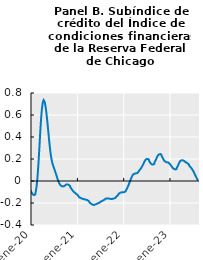
| Category | -0.0836 |
|---|---|
| 2020-01-02 | -0.084 |
| 2020-01-03 | -0.099 |
| 2020-01-06 | -0.099 |
| 2020-01-07 | -0.099 |
| 2020-01-08 | -0.099 |
| 2020-01-09 | -0.099 |
| 2020-01-10 | -0.112 |
| 2020-01-13 | -0.112 |
| 2020-01-14 | -0.112 |
| 2020-01-15 | -0.112 |
| 2020-01-16 | -0.112 |
| 2020-01-17 | -0.123 |
| 2020-01-20 | -0.123 |
| 2020-01-21 | -0.123 |
| 2020-01-22 | -0.123 |
| 2020-01-23 | -0.123 |
| 2020-01-24 | -0.128 |
| 2020-01-27 | -0.128 |
| 2020-01-28 | -0.128 |
| 2020-01-29 | -0.128 |
| 2020-01-30 | -0.128 |
| 2020-01-31 | -0.122 |
| 2020-02-03 | -0.122 |
| 2020-02-04 | -0.122 |
| 2020-02-05 | -0.122 |
| 2020-02-06 | -0.122 |
| 2020-02-07 | -0.101 |
| 2020-02-10 | -0.101 |
| 2020-02-11 | -0.101 |
| 2020-02-12 | -0.101 |
| 2020-02-13 | -0.101 |
| 2020-02-14 | -0.055 |
| 2020-02-17 | -0.055 |
| 2020-02-18 | -0.055 |
| 2020-02-19 | -0.055 |
| 2020-02-20 | -0.055 |
| 2020-02-21 | 0.024 |
| 2020-02-24 | 0.024 |
| 2020-02-25 | 0.024 |
| 2020-02-26 | 0.024 |
| 2020-02-27 | 0.024 |
| 2020-02-28 | 0.135 |
| 2020-03-02 | 0.135 |
| 2020-03-03 | 0.135 |
| 2020-03-04 | 0.135 |
| 2020-03-05 | 0.135 |
| 2020-03-06 | 0.271 |
| 2020-03-09 | 0.271 |
| 2020-03-10 | 0.271 |
| 2020-03-11 | 0.271 |
| 2020-03-12 | 0.271 |
| 2020-03-13 | 0.415 |
| 2020-03-16 | 0.415 |
| 2020-03-17 | 0.415 |
| 2020-03-18 | 0.415 |
| 2020-03-19 | 0.415 |
| 2020-03-20 | 0.549 |
| 2020-03-23 | 0.549 |
| 2020-03-24 | 0.549 |
| 2020-03-25 | 0.549 |
| 2020-03-26 | 0.549 |
| 2020-03-27 | 0.649 |
| 2020-03-30 | 0.649 |
| 2020-03-31 | 0.649 |
| 2020-04-01 | 0.649 |
| 2020-04-02 | 0.649 |
| 2020-04-03 | 0.712 |
| 2020-04-06 | 0.712 |
| 2020-04-07 | 0.712 |
| 2020-04-08 | 0.712 |
| 2020-04-09 | 0.712 |
| 2020-04-10 | 0.736 |
| 2020-04-13 | 0.736 |
| 2020-04-14 | 0.736 |
| 2020-04-15 | 0.736 |
| 2020-04-16 | 0.736 |
| 2020-04-17 | 0.724 |
| 2020-04-20 | 0.724 |
| 2020-04-21 | 0.724 |
| 2020-04-22 | 0.724 |
| 2020-04-23 | 0.724 |
| 2020-04-24 | 0.688 |
| 2020-04-27 | 0.688 |
| 2020-04-28 | 0.688 |
| 2020-04-29 | 0.688 |
| 2020-04-30 | 0.688 |
| 2020-05-01 | 0.629 |
| 2020-05-04 | 0.629 |
| 2020-05-05 | 0.629 |
| 2020-05-06 | 0.629 |
| 2020-05-07 | 0.629 |
| 2020-05-08 | 0.555 |
| 2020-05-11 | 0.555 |
| 2020-05-12 | 0.555 |
| 2020-05-13 | 0.555 |
| 2020-05-14 | 0.555 |
| 2020-05-15 | 0.473 |
| 2020-05-18 | 0.473 |
| 2020-05-19 | 0.473 |
| 2020-05-20 | 0.473 |
| 2020-05-21 | 0.473 |
| 2020-05-22 | 0.388 |
| 2020-05-25 | 0.388 |
| 2020-05-26 | 0.388 |
| 2020-05-27 | 0.388 |
| 2020-05-28 | 0.388 |
| 2020-05-29 | 0.309 |
| 2020-06-01 | 0.309 |
| 2020-06-02 | 0.309 |
| 2020-06-03 | 0.309 |
| 2020-06-04 | 0.309 |
| 2020-06-05 | 0.243 |
| 2020-06-08 | 0.243 |
| 2020-06-09 | 0.243 |
| 2020-06-10 | 0.243 |
| 2020-06-11 | 0.243 |
| 2020-06-12 | 0.194 |
| 2020-06-15 | 0.194 |
| 2020-06-16 | 0.194 |
| 2020-06-17 | 0.194 |
| 2020-06-18 | 0.194 |
| 2020-06-19 | 0.158 |
| 2020-06-22 | 0.158 |
| 2020-06-23 | 0.158 |
| 2020-06-24 | 0.158 |
| 2020-06-25 | 0.158 |
| 2020-06-26 | 0.133 |
| 2020-06-29 | 0.133 |
| 2020-06-30 | 0.133 |
| 2020-07-01 | 0.133 |
| 2020-07-02 | 0.133 |
| 2020-07-03 | 0.111 |
| 2020-07-06 | 0.111 |
| 2020-07-07 | 0.111 |
| 2020-07-08 | 0.111 |
| 2020-07-09 | 0.111 |
| 2020-07-10 | 0.087 |
| 2020-07-13 | 0.087 |
| 2020-07-14 | 0.087 |
| 2020-07-15 | 0.087 |
| 2020-07-16 | 0.087 |
| 2020-07-17 | 0.063 |
| 2020-07-20 | 0.063 |
| 2020-07-21 | 0.063 |
| 2020-07-22 | 0.063 |
| 2020-07-23 | 0.063 |
| 2020-07-24 | 0.037 |
| 2020-07-27 | 0.037 |
| 2020-07-28 | 0.037 |
| 2020-07-29 | 0.037 |
| 2020-07-30 | 0.037 |
| 2020-07-31 | 0.012 |
| 2020-08-03 | 0.012 |
| 2020-08-04 | 0.012 |
| 2020-08-05 | 0.012 |
| 2020-08-06 | 0.012 |
| 2020-08-07 | -0.009 |
| 2020-08-10 | -0.009 |
| 2020-08-11 | -0.009 |
| 2020-08-12 | -0.009 |
| 2020-08-13 | -0.009 |
| 2020-08-14 | -0.026 |
| 2020-08-17 | -0.026 |
| 2020-08-18 | -0.026 |
| 2020-08-19 | -0.026 |
| 2020-08-20 | -0.026 |
| 2020-08-21 | -0.039 |
| 2020-08-24 | -0.039 |
| 2020-08-25 | -0.039 |
| 2020-08-26 | -0.039 |
| 2020-08-27 | -0.039 |
| 2020-08-28 | -0.047 |
| 2020-08-31 | -0.047 |
| 2020-09-01 | -0.047 |
| 2020-09-02 | -0.047 |
| 2020-09-03 | -0.047 |
| 2020-09-04 | -0.049 |
| 2020-09-07 | -0.049 |
| 2020-09-08 | -0.049 |
| 2020-09-09 | -0.049 |
| 2020-09-10 | -0.049 |
| 2020-09-11 | -0.048 |
| 2020-09-14 | -0.048 |
| 2020-09-15 | -0.048 |
| 2020-09-16 | -0.048 |
| 2020-09-17 | -0.048 |
| 2020-09-18 | -0.044 |
| 2020-09-21 | -0.044 |
| 2020-09-22 | -0.044 |
| 2020-09-23 | -0.044 |
| 2020-09-24 | -0.044 |
| 2020-09-25 | -0.038 |
| 2020-09-28 | -0.038 |
| 2020-09-29 | -0.038 |
| 2020-09-30 | -0.038 |
| 2020-10-01 | -0.038 |
| 2020-10-02 | -0.033 |
| 2020-10-05 | -0.033 |
| 2020-10-06 | -0.033 |
| 2020-10-07 | -0.033 |
| 2020-10-08 | -0.033 |
| 2020-10-09 | -0.031 |
| 2020-10-12 | -0.031 |
| 2020-10-13 | -0.031 |
| 2020-10-14 | -0.031 |
| 2020-10-15 | -0.031 |
| 2020-10-16 | -0.033 |
| 2020-10-19 | -0.033 |
| 2020-10-20 | -0.033 |
| 2020-10-21 | -0.033 |
| 2020-10-22 | -0.033 |
| 2020-10-23 | -0.038 |
| 2020-10-26 | -0.038 |
| 2020-10-27 | -0.038 |
| 2020-10-28 | -0.038 |
| 2020-10-29 | -0.038 |
| 2020-10-30 | -0.045 |
| 2020-11-02 | -0.045 |
| 2020-11-03 | -0.045 |
| 2020-11-04 | -0.045 |
| 2020-11-05 | -0.045 |
| 2020-11-06 | -0.055 |
| 2020-11-09 | -0.055 |
| 2020-11-10 | -0.055 |
| 2020-11-11 | -0.055 |
| 2020-11-12 | -0.055 |
| 2020-11-13 | -0.067 |
| 2020-11-16 | -0.067 |
| 2020-11-17 | -0.067 |
| 2020-11-18 | -0.067 |
| 2020-11-19 | -0.067 |
| 2020-11-20 | -0.079 |
| 2020-11-23 | -0.079 |
| 2020-11-24 | -0.079 |
| 2020-11-25 | -0.079 |
| 2020-11-26 | -0.079 |
| 2020-11-27 | -0.089 |
| 2020-11-30 | -0.089 |
| 2020-12-01 | -0.089 |
| 2020-12-02 | -0.089 |
| 2020-12-03 | -0.089 |
| 2020-12-04 | -0.099 |
| 2020-12-07 | -0.099 |
| 2020-12-08 | -0.099 |
| 2020-12-09 | -0.099 |
| 2020-12-10 | -0.099 |
| 2020-12-11 | -0.108 |
| 2020-12-14 | -0.108 |
| 2020-12-15 | -0.108 |
| 2020-12-16 | -0.108 |
| 2020-12-17 | -0.108 |
| 2020-12-18 | -0.116 |
| 2020-12-21 | -0.116 |
| 2020-12-22 | -0.116 |
| 2020-12-23 | -0.116 |
| 2020-12-24 | -0.116 |
| 2020-12-25 | -0.124 |
| 2020-12-28 | -0.124 |
| 2020-12-29 | -0.124 |
| 2020-12-30 | -0.124 |
| 2020-12-31 | -0.124 |
| 2021-01-01 | -0.132 |
| 2021-01-04 | -0.132 |
| 2021-01-05 | -0.132 |
| 2021-01-06 | -0.132 |
| 2021-01-07 | -0.132 |
| 2021-01-08 | -0.14 |
| 2021-01-11 | -0.14 |
| 2021-01-12 | -0.14 |
| 2021-01-13 | -0.14 |
| 2021-01-14 | -0.14 |
| 2021-01-15 | -0.147 |
| 2021-01-18 | -0.147 |
| 2021-01-19 | -0.147 |
| 2021-01-20 | -0.147 |
| 2021-01-21 | -0.147 |
| 2021-01-22 | -0.153 |
| 2021-01-25 | -0.153 |
| 2021-01-26 | -0.153 |
| 2021-01-27 | -0.153 |
| 2021-01-28 | -0.153 |
| 2021-01-29 | -0.158 |
| 2021-02-01 | -0.158 |
| 2021-02-02 | -0.158 |
| 2021-02-03 | -0.158 |
| 2021-02-04 | -0.158 |
| 2021-02-05 | -0.161 |
| 2021-02-08 | -0.161 |
| 2021-02-09 | -0.161 |
| 2021-02-10 | -0.161 |
| 2021-02-11 | -0.161 |
| 2021-02-12 | -0.164 |
| 2021-02-15 | -0.164 |
| 2021-02-16 | -0.164 |
| 2021-02-17 | -0.164 |
| 2021-02-18 | -0.164 |
| 2021-02-19 | -0.165 |
| 2021-02-22 | -0.165 |
| 2021-02-23 | -0.165 |
| 2021-02-24 | -0.165 |
| 2021-02-25 | -0.165 |
| 2021-02-26 | -0.167 |
| 2021-03-01 | -0.167 |
| 2021-03-02 | -0.167 |
| 2021-03-03 | -0.167 |
| 2021-03-04 | -0.167 |
| 2021-03-05 | -0.169 |
| 2021-03-08 | -0.169 |
| 2021-03-09 | -0.169 |
| 2021-03-10 | -0.169 |
| 2021-03-11 | -0.169 |
| 2021-03-12 | -0.172 |
| 2021-03-15 | -0.172 |
| 2021-03-16 | -0.172 |
| 2021-03-17 | -0.172 |
| 2021-03-18 | -0.172 |
| 2021-03-19 | -0.176 |
| 2021-03-22 | -0.176 |
| 2021-03-23 | -0.176 |
| 2021-03-24 | -0.176 |
| 2021-03-25 | -0.176 |
| 2021-03-26 | -0.182 |
| 2021-03-29 | -0.182 |
| 2021-03-30 | -0.182 |
| 2021-03-31 | -0.182 |
| 2021-04-01 | -0.182 |
| 2021-04-02 | -0.189 |
| 2021-04-05 | -0.189 |
| 2021-04-06 | -0.189 |
| 2021-04-07 | -0.189 |
| 2021-04-08 | -0.189 |
| 2021-04-09 | -0.198 |
| 2021-04-12 | -0.198 |
| 2021-04-13 | -0.198 |
| 2021-04-14 | -0.198 |
| 2021-04-15 | -0.198 |
| 2021-04-16 | -0.206 |
| 2021-04-19 | -0.206 |
| 2021-04-20 | -0.206 |
| 2021-04-21 | -0.206 |
| 2021-04-22 | -0.206 |
| 2021-04-23 | -0.212 |
| 2021-04-26 | -0.212 |
| 2021-04-27 | -0.212 |
| 2021-04-28 | -0.212 |
| 2021-04-29 | -0.212 |
| 2021-04-30 | -0.217 |
| 2021-05-03 | -0.217 |
| 2021-05-04 | -0.217 |
| 2021-05-05 | -0.217 |
| 2021-05-06 | -0.217 |
| 2021-05-07 | -0.219 |
| 2021-05-10 | -0.219 |
| 2021-05-11 | -0.219 |
| 2021-05-12 | -0.219 |
| 2021-05-13 | -0.219 |
| 2021-05-14 | -0.217 |
| 2021-05-17 | -0.217 |
| 2021-05-18 | -0.217 |
| 2021-05-19 | -0.217 |
| 2021-05-20 | -0.217 |
| 2021-05-21 | -0.214 |
| 2021-05-24 | -0.214 |
| 2021-05-25 | -0.214 |
| 2021-05-26 | -0.214 |
| 2021-05-27 | -0.214 |
| 2021-05-28 | -0.21 |
| 2021-05-31 | -0.21 |
| 2021-06-01 | -0.21 |
| 2021-06-02 | -0.21 |
| 2021-06-03 | -0.21 |
| 2021-06-04 | -0.205 |
| 2021-06-07 | -0.205 |
| 2021-06-08 | -0.205 |
| 2021-06-09 | -0.205 |
| 2021-06-10 | -0.205 |
| 2021-06-11 | -0.201 |
| 2021-06-14 | -0.201 |
| 2021-06-15 | -0.201 |
| 2021-06-16 | -0.201 |
| 2021-06-17 | -0.201 |
| 2021-06-18 | -0.197 |
| 2021-06-21 | -0.197 |
| 2021-06-22 | -0.197 |
| 2021-06-23 | -0.197 |
| 2021-06-24 | -0.197 |
| 2021-06-25 | -0.193 |
| 2021-06-28 | -0.193 |
| 2021-06-29 | -0.193 |
| 2021-06-30 | -0.193 |
| 2021-07-01 | -0.193 |
| 2021-07-02 | -0.189 |
| 2021-07-05 | -0.189 |
| 2021-07-06 | -0.189 |
| 2021-07-07 | -0.189 |
| 2021-07-08 | -0.189 |
| 2021-07-09 | -0.184 |
| 2021-07-12 | -0.184 |
| 2021-07-13 | -0.184 |
| 2021-07-14 | -0.184 |
| 2021-07-15 | -0.184 |
| 2021-07-16 | -0.179 |
| 2021-07-19 | -0.179 |
| 2021-07-20 | -0.179 |
| 2021-07-21 | -0.179 |
| 2021-07-22 | -0.179 |
| 2021-07-23 | -0.173 |
| 2021-07-26 | -0.173 |
| 2021-07-27 | -0.173 |
| 2021-07-28 | -0.173 |
| 2021-07-29 | -0.173 |
| 2021-07-30 | -0.169 |
| 2021-08-02 | -0.169 |
| 2021-08-03 | -0.169 |
| 2021-08-04 | -0.169 |
| 2021-08-05 | -0.169 |
| 2021-08-06 | -0.164 |
| 2021-08-09 | -0.164 |
| 2021-08-10 | -0.164 |
| 2021-08-11 | -0.164 |
| 2021-08-12 | -0.164 |
| 2021-08-13 | -0.16 |
| 2021-08-16 | -0.16 |
| 2021-08-17 | -0.16 |
| 2021-08-18 | -0.16 |
| 2021-08-19 | -0.16 |
| 2021-08-20 | -0.158 |
| 2021-08-23 | -0.158 |
| 2021-08-24 | -0.158 |
| 2021-08-25 | -0.158 |
| 2021-08-26 | -0.158 |
| 2021-08-27 | -0.158 |
| 2021-08-30 | -0.158 |
| 2021-08-31 | -0.158 |
| 2021-09-01 | -0.158 |
| 2021-09-02 | -0.158 |
| 2021-09-03 | -0.16 |
| 2021-09-06 | -0.16 |
| 2021-09-07 | -0.16 |
| 2021-09-08 | -0.16 |
| 2021-09-09 | -0.16 |
| 2021-09-10 | -0.162 |
| 2021-09-13 | -0.162 |
| 2021-09-14 | -0.162 |
| 2021-09-15 | -0.162 |
| 2021-09-16 | -0.162 |
| 2021-09-17 | -0.163 |
| 2021-09-20 | -0.163 |
| 2021-09-21 | -0.163 |
| 2021-09-22 | -0.163 |
| 2021-09-23 | -0.163 |
| 2021-09-24 | -0.164 |
| 2021-09-27 | -0.164 |
| 2021-09-28 | -0.164 |
| 2021-09-29 | -0.164 |
| 2021-09-30 | -0.164 |
| 2021-10-01 | -0.163 |
| 2021-10-04 | -0.163 |
| 2021-10-05 | -0.163 |
| 2021-10-06 | -0.163 |
| 2021-10-07 | -0.163 |
| 2021-10-08 | -0.161 |
| 2021-10-11 | -0.161 |
| 2021-10-12 | -0.161 |
| 2021-10-13 | -0.161 |
| 2021-10-14 | -0.161 |
| 2021-10-15 | -0.158 |
| 2021-10-18 | -0.158 |
| 2021-10-19 | -0.158 |
| 2021-10-20 | -0.158 |
| 2021-10-21 | -0.158 |
| 2021-10-22 | -0.154 |
| 2021-10-25 | -0.154 |
| 2021-10-26 | -0.154 |
| 2021-10-27 | -0.154 |
| 2021-10-28 | -0.154 |
| 2021-10-29 | -0.148 |
| 2021-11-01 | -0.148 |
| 2021-11-02 | -0.148 |
| 2021-11-03 | -0.148 |
| 2021-11-04 | -0.148 |
| 2021-11-05 | -0.141 |
| 2021-11-08 | -0.141 |
| 2021-11-09 | -0.141 |
| 2021-11-10 | -0.141 |
| 2021-11-11 | -0.141 |
| 2021-11-12 | -0.133 |
| 2021-11-15 | -0.133 |
| 2021-11-16 | -0.133 |
| 2021-11-17 | -0.133 |
| 2021-11-18 | -0.133 |
| 2021-11-19 | -0.123 |
| 2021-11-22 | -0.123 |
| 2021-11-23 | -0.123 |
| 2021-11-24 | -0.123 |
| 2021-11-25 | -0.123 |
| 2021-11-26 | -0.114 |
| 2021-11-29 | -0.114 |
| 2021-11-30 | -0.114 |
| 2021-12-01 | -0.114 |
| 2021-12-02 | -0.114 |
| 2021-12-03 | -0.107 |
| 2021-12-06 | -0.107 |
| 2021-12-07 | -0.107 |
| 2021-12-08 | -0.107 |
| 2021-12-09 | -0.107 |
| 2021-12-10 | -0.104 |
| 2021-12-13 | -0.104 |
| 2021-12-14 | -0.104 |
| 2021-12-15 | -0.104 |
| 2021-12-16 | -0.104 |
| 2021-12-17 | -0.103 |
| 2021-12-20 | -0.103 |
| 2021-12-21 | -0.103 |
| 2021-12-22 | -0.103 |
| 2021-12-23 | -0.103 |
| 2021-12-24 | -0.104 |
| 2021-12-27 | -0.104 |
| 2021-12-28 | -0.104 |
| 2021-12-29 | -0.104 |
| 2021-12-30 | -0.104 |
| 2021-12-31 | -0.104 |
| 2022-01-03 | -0.104 |
| 2022-01-04 | -0.104 |
| 2022-01-05 | -0.104 |
| 2022-01-06 | -0.104 |
| 2022-01-07 | -0.1 |
| 2022-01-10 | -0.1 |
| 2022-01-11 | -0.1 |
| 2022-01-12 | -0.1 |
| 2022-01-13 | -0.1 |
| 2022-01-14 | -0.093 |
| 2022-01-17 | -0.093 |
| 2022-01-18 | -0.093 |
| 2022-01-19 | -0.093 |
| 2022-01-20 | -0.093 |
| 2022-01-21 | -0.082 |
| 2022-01-24 | -0.082 |
| 2022-01-25 | -0.082 |
| 2022-01-26 | -0.082 |
| 2022-01-27 | -0.082 |
| 2022-01-28 | -0.067 |
| 2022-01-31 | -0.067 |
| 2022-02-01 | -0.067 |
| 2022-02-02 | -0.067 |
| 2022-02-03 | -0.067 |
| 2022-02-04 | -0.05 |
| 2022-02-07 | -0.05 |
| 2022-02-08 | -0.05 |
| 2022-02-09 | -0.05 |
| 2022-02-10 | -0.05 |
| 2022-02-11 | -0.031 |
| 2022-02-14 | -0.031 |
| 2022-02-15 | -0.031 |
| 2022-02-16 | -0.031 |
| 2022-02-17 | -0.031 |
| 2022-02-18 | -0.009 |
| 2022-02-21 | -0.009 |
| 2022-02-22 | -0.009 |
| 2022-02-23 | -0.009 |
| 2022-02-24 | -0.009 |
| 2022-02-25 | 0.012 |
| 2022-02-28 | 0.012 |
| 2022-03-01 | 0.012 |
| 2022-03-02 | 0.012 |
| 2022-03-03 | 0.012 |
| 2022-03-04 | 0.032 |
| 2022-03-07 | 0.032 |
| 2022-03-08 | 0.032 |
| 2022-03-09 | 0.032 |
| 2022-03-10 | 0.032 |
| 2022-03-11 | 0.049 |
| 2022-03-14 | 0.049 |
| 2022-03-15 | 0.049 |
| 2022-03-16 | 0.049 |
| 2022-03-17 | 0.049 |
| 2022-03-18 | 0.06 |
| 2022-03-21 | 0.06 |
| 2022-03-22 | 0.06 |
| 2022-03-23 | 0.06 |
| 2022-03-24 | 0.06 |
| 2022-03-25 | 0.066 |
| 2022-03-28 | 0.066 |
| 2022-03-29 | 0.066 |
| 2022-03-30 | 0.066 |
| 2022-03-31 | 0.066 |
| 2022-04-01 | 0.069 |
| 2022-04-04 | 0.069 |
| 2022-04-05 | 0.069 |
| 2022-04-06 | 0.069 |
| 2022-04-07 | 0.069 |
| 2022-04-08 | 0.07 |
| 2022-04-11 | 0.07 |
| 2022-04-12 | 0.07 |
| 2022-04-13 | 0.07 |
| 2022-04-14 | 0.07 |
| 2022-04-15 | 0.073 |
| 2022-04-18 | 0.073 |
| 2022-04-19 | 0.073 |
| 2022-04-20 | 0.073 |
| 2022-04-21 | 0.073 |
| 2022-04-22 | 0.079 |
| 2022-04-25 | 0.079 |
| 2022-04-26 | 0.079 |
| 2022-04-27 | 0.079 |
| 2022-04-28 | 0.079 |
| 2022-04-29 | 0.087 |
| 2022-05-02 | 0.087 |
| 2022-05-03 | 0.087 |
| 2022-05-04 | 0.087 |
| 2022-05-05 | 0.087 |
| 2022-05-06 | 0.097 |
| 2022-05-09 | 0.097 |
| 2022-05-10 | 0.097 |
| 2022-05-11 | 0.097 |
| 2022-05-12 | 0.097 |
| 2022-05-13 | 0.108 |
| 2022-05-16 | 0.108 |
| 2022-05-17 | 0.108 |
| 2022-05-18 | 0.108 |
| 2022-05-19 | 0.108 |
| 2022-05-20 | 0.12 |
| 2022-05-23 | 0.12 |
| 2022-05-24 | 0.12 |
| 2022-05-25 | 0.12 |
| 2022-05-26 | 0.12 |
| 2022-05-27 | 0.133 |
| 2022-05-30 | 0.133 |
| 2022-05-31 | 0.133 |
| 2022-06-01 | 0.133 |
| 2022-06-02 | 0.133 |
| 2022-06-03 | 0.149 |
| 2022-06-06 | 0.149 |
| 2022-06-07 | 0.149 |
| 2022-06-08 | 0.149 |
| 2022-06-09 | 0.149 |
| 2022-06-10 | 0.165 |
| 2022-06-13 | 0.165 |
| 2022-06-14 | 0.165 |
| 2022-06-15 | 0.165 |
| 2022-06-16 | 0.165 |
| 2022-06-17 | 0.182 |
| 2022-06-20 | 0.182 |
| 2022-06-21 | 0.182 |
| 2022-06-22 | 0.182 |
| 2022-06-23 | 0.182 |
| 2022-06-24 | 0.194 |
| 2022-06-27 | 0.194 |
| 2022-06-28 | 0.194 |
| 2022-06-29 | 0.194 |
| 2022-06-30 | 0.194 |
| 2022-07-01 | 0.201 |
| 2022-07-04 | 0.201 |
| 2022-07-05 | 0.201 |
| 2022-07-06 | 0.201 |
| 2022-07-07 | 0.201 |
| 2022-07-08 | 0.201 |
| 2022-07-11 | 0.201 |
| 2022-07-12 | 0.201 |
| 2022-07-13 | 0.201 |
| 2022-07-14 | 0.201 |
| 2022-07-15 | 0.193 |
| 2022-07-18 | 0.193 |
| 2022-07-19 | 0.193 |
| 2022-07-20 | 0.193 |
| 2022-07-21 | 0.193 |
| 2022-07-22 | 0.181 |
| 2022-07-25 | 0.181 |
| 2022-07-26 | 0.181 |
| 2022-07-27 | 0.181 |
| 2022-07-28 | 0.181 |
| 2022-07-29 | 0.167 |
| 2022-08-01 | 0.167 |
| 2022-08-02 | 0.167 |
| 2022-08-03 | 0.167 |
| 2022-08-04 | 0.167 |
| 2022-08-05 | 0.156 |
| 2022-08-08 | 0.156 |
| 2022-08-09 | 0.156 |
| 2022-08-10 | 0.156 |
| 2022-08-11 | 0.156 |
| 2022-08-12 | 0.15 |
| 2022-08-15 | 0.15 |
| 2022-08-16 | 0.15 |
| 2022-08-17 | 0.15 |
| 2022-08-18 | 0.15 |
| 2022-08-19 | 0.15 |
| 2022-08-22 | 0.15 |
| 2022-08-23 | 0.15 |
| 2022-08-24 | 0.15 |
| 2022-08-25 | 0.15 |
| 2022-08-26 | 0.156 |
| 2022-08-29 | 0.156 |
| 2022-08-30 | 0.156 |
| 2022-08-31 | 0.156 |
| 2022-09-01 | 0.156 |
| 2022-09-02 | 0.168 |
| 2022-09-05 | 0.168 |
| 2022-09-06 | 0.168 |
| 2022-09-07 | 0.168 |
| 2022-09-08 | 0.168 |
| 2022-09-09 | 0.184 |
| 2022-09-12 | 0.184 |
| 2022-09-13 | 0.184 |
| 2022-09-14 | 0.184 |
| 2022-09-15 | 0.184 |
| 2022-09-16 | 0.202 |
| 2022-09-19 | 0.202 |
| 2022-09-20 | 0.202 |
| 2022-09-21 | 0.202 |
| 2022-09-22 | 0.202 |
| 2022-09-23 | 0.22 |
| 2022-09-26 | 0.22 |
| 2022-09-27 | 0.22 |
| 2022-09-28 | 0.22 |
| 2022-09-29 | 0.22 |
| 2022-09-30 | 0.235 |
| 2022-10-03 | 0.235 |
| 2022-10-04 | 0.235 |
| 2022-10-05 | 0.235 |
| 2022-10-06 | 0.235 |
| 2022-10-07 | 0.243 |
| 2022-10-10 | 0.243 |
| 2022-10-11 | 0.243 |
| 2022-10-12 | 0.243 |
| 2022-10-13 | 0.243 |
| 2022-10-14 | 0.245 |
| 2022-10-17 | 0.245 |
| 2022-10-18 | 0.245 |
| 2022-10-19 | 0.245 |
| 2022-10-20 | 0.245 |
| 2022-10-21 | 0.239 |
| 2022-10-24 | 0.239 |
| 2022-10-25 | 0.239 |
| 2022-10-26 | 0.239 |
| 2022-10-27 | 0.239 |
| 2022-10-28 | 0.227 |
| 2022-10-31 | 0.227 |
| 2022-11-01 | 0.227 |
| 2022-11-02 | 0.227 |
| 2022-11-03 | 0.227 |
| 2022-11-04 | 0.212 |
| 2022-11-07 | 0.212 |
| 2022-11-08 | 0.212 |
| 2022-11-09 | 0.212 |
| 2022-11-10 | 0.212 |
| 2022-11-11 | 0.196 |
| 2022-11-14 | 0.196 |
| 2022-11-15 | 0.196 |
| 2022-11-16 | 0.196 |
| 2022-11-17 | 0.196 |
| 2022-11-18 | 0.184 |
| 2022-11-21 | 0.184 |
| 2022-11-22 | 0.184 |
| 2022-11-23 | 0.184 |
| 2022-11-24 | 0.184 |
| 2022-11-25 | 0.175 |
| 2022-11-28 | 0.175 |
| 2022-11-29 | 0.175 |
| 2022-11-30 | 0.175 |
| 2022-12-01 | 0.175 |
| 2022-12-02 | 0.171 |
| 2022-12-05 | 0.171 |
| 2022-12-06 | 0.171 |
| 2022-12-07 | 0.171 |
| 2022-12-08 | 0.171 |
| 2022-12-09 | 0.169 |
| 2022-12-12 | 0.169 |
| 2022-12-13 | 0.169 |
| 2022-12-14 | 0.169 |
| 2022-12-15 | 0.169 |
| 2022-12-16 | 0.166 |
| 2022-12-19 | 0.166 |
| 2022-12-20 | 0.166 |
| 2022-12-21 | 0.166 |
| 2022-12-22 | 0.166 |
| 2022-12-23 | 0.163 |
| 2022-12-26 | 0.163 |
| 2022-12-27 | 0.163 |
| 2022-12-28 | 0.163 |
| 2022-12-29 | 0.163 |
| 2022-12-30 | 0.156 |
| 2023-01-02 | 0.156 |
| 2023-01-03 | 0.156 |
| 2023-01-04 | 0.156 |
| 2023-01-05 | 0.156 |
| 2023-01-06 | 0.146 |
| 2023-01-09 | 0.146 |
| 2023-01-10 | 0.146 |
| 2023-01-11 | 0.146 |
| 2023-01-12 | 0.146 |
| 2023-01-13 | 0.135 |
| 2023-01-16 | 0.135 |
| 2023-01-17 | 0.135 |
| 2023-01-18 | 0.135 |
| 2023-01-19 | 0.135 |
| 2023-01-20 | 0.124 |
| 2023-01-23 | 0.124 |
| 2023-01-24 | 0.124 |
| 2023-01-25 | 0.124 |
| 2023-01-26 | 0.124 |
| 2023-01-27 | 0.115 |
| 2023-01-30 | 0.115 |
| 2023-01-31 | 0.115 |
| 2023-02-01 | 0.115 |
| 2023-02-02 | 0.115 |
| 2023-02-03 | 0.108 |
| 2023-02-06 | 0.108 |
| 2023-02-07 | 0.108 |
| 2023-02-08 | 0.108 |
| 2023-02-09 | 0.108 |
| 2023-02-10 | 0.105 |
| 2023-02-13 | 0.105 |
| 2023-02-14 | 0.105 |
| 2023-02-15 | 0.105 |
| 2023-02-16 | 0.105 |
| 2023-02-17 | 0.108 |
| 2023-02-20 | 0.108 |
| 2023-02-21 | 0.108 |
| 2023-02-22 | 0.108 |
| 2023-02-23 | 0.108 |
| 2023-02-24 | 0.118 |
| 2023-02-27 | 0.118 |
| 2023-02-28 | 0.118 |
| 2023-03-01 | 0.118 |
| 2023-03-02 | 0.118 |
| 2023-03-03 | 0.133 |
| 2023-03-06 | 0.133 |
| 2023-03-07 | 0.133 |
| 2023-03-08 | 0.133 |
| 2023-03-09 | 0.133 |
| 2023-03-10 | 0.151 |
| 2023-03-13 | 0.151 |
| 2023-03-14 | 0.151 |
| 2023-03-15 | 0.151 |
| 2023-03-16 | 0.151 |
| 2023-03-17 | 0.169 |
| 2023-03-20 | 0.169 |
| 2023-03-21 | 0.169 |
| 2023-03-22 | 0.169 |
| 2023-03-23 | 0.169 |
| 2023-03-24 | 0.182 |
| 2023-03-27 | 0.182 |
| 2023-03-28 | 0.182 |
| 2023-03-29 | 0.182 |
| 2023-03-30 | 0.182 |
| 2023-03-31 | 0.188 |
| 2023-04-03 | 0.188 |
| 2023-04-04 | 0.188 |
| 2023-04-05 | 0.188 |
| 2023-04-06 | 0.188 |
| 2023-04-07 | 0.188 |
| 2023-04-10 | 0.188 |
| 2023-04-11 | 0.188 |
| 2023-04-12 | 0.188 |
| 2023-04-13 | 0.188 |
| 2023-04-14 | 0.185 |
| 2023-04-17 | 0.185 |
| 2023-04-18 | 0.185 |
| 2023-04-19 | 0.185 |
| 2023-04-20 | 0.185 |
| 2023-04-21 | 0.18 |
| 2023-04-24 | 0.18 |
| 2023-04-25 | 0.18 |
| 2023-04-26 | 0.18 |
| 2023-04-27 | 0.18 |
| 2023-04-28 | 0.175 |
| 2023-05-01 | 0.175 |
| 2023-05-02 | 0.175 |
| 2023-05-03 | 0.175 |
| 2023-05-04 | 0.175 |
| 2023-05-05 | 0.171 |
| 2023-05-08 | 0.171 |
| 2023-05-09 | 0.171 |
| 2023-05-10 | 0.171 |
| 2023-05-11 | 0.171 |
| 2023-05-12 | 0.165 |
| 2023-05-15 | 0.165 |
| 2023-05-16 | 0.165 |
| 2023-05-17 | 0.165 |
| 2023-05-18 | 0.165 |
| 2023-05-19 | 0.158 |
| 2023-05-22 | 0.158 |
| 2023-05-23 | 0.158 |
| 2023-05-24 | 0.158 |
| 2023-05-25 | 0.158 |
| 2023-05-26 | 0.15 |
| 2023-05-29 | 0.15 |
| 2023-05-30 | 0.15 |
| 2023-05-31 | 0.15 |
| 2023-06-01 | 0.15 |
| 2023-06-02 | 0.14 |
| 2023-06-05 | 0.14 |
| 2023-06-06 | 0.14 |
| 2023-06-07 | 0.14 |
| 2023-06-08 | 0.14 |
| 2023-06-09 | 0.131 |
| 2023-06-12 | 0.131 |
| 2023-06-13 | 0.131 |
| 2023-06-14 | 0.131 |
| 2023-06-15 | 0.131 |
| 2023-06-16 | 0.121 |
| 2023-06-19 | 0.121 |
| 2023-06-20 | 0.121 |
| 2023-06-21 | 0.121 |
| 2023-06-22 | 0.121 |
| 2023-06-23 | 0.111 |
| 2023-06-26 | 0.111 |
| 2023-06-27 | 0.111 |
| 2023-06-28 | 0.111 |
| 2023-06-29 | 0.111 |
| 2023-06-30 | 0.099 |
| 2023-07-03 | 0.099 |
| 2023-07-04 | 0.099 |
| 2023-07-05 | 0.099 |
| 2023-07-06 | 0.099 |
| 2023-07-07 | 0.085 |
| 2023-07-10 | 0.085 |
| 2023-07-11 | 0.085 |
| 2023-07-12 | 0.085 |
| 2023-07-13 | 0.085 |
| 2023-07-14 | 0.068 |
| 2023-07-17 | 0.068 |
| 2023-07-18 | 0.068 |
| 2023-07-19 | 0.068 |
| 2023-07-20 | 0.068 |
| 2023-07-21 | 0.05 |
| 2023-07-24 | 0.05 |
| 2023-07-25 | 0.05 |
| 2023-07-26 | 0.05 |
| 2023-07-27 | 0.05 |
| 2023-07-28 | 0.033 |
| 2023-07-31 | 0.033 |
| 2023-08-01 | 0.033 |
| 2023-08-02 | 0.033 |
| 2023-08-03 | 0.033 |
| 2023-08-04 | 0.017 |
| 2023-08-07 | 0.017 |
| 2023-08-08 | 0.017 |
| 2023-08-09 | 0.017 |
| 2023-08-10 | 0.017 |
| 2023-08-11 | 0.005 |
| 2023-08-14 | 0.005 |
| 2023-08-15 | 0.005 |
| 2023-08-16 | 0.005 |
| 2023-08-17 | 0.005 |
| 2023-08-18 | -0.004 |